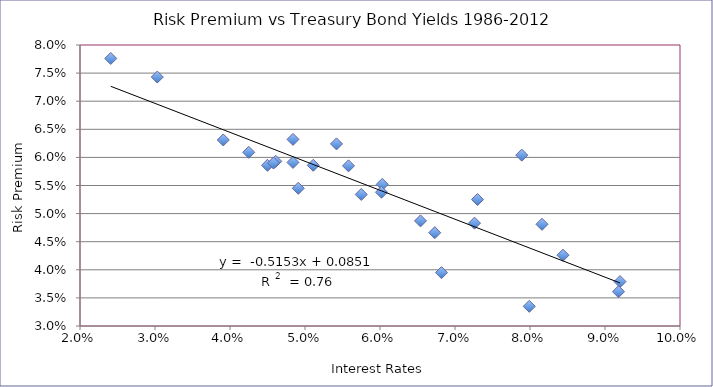
| Category | Series 0 |
|---|---|
| 0.0789 | 0.06 |
| 0.092 | 0.038 |
| 0.0918 | 0.036 |
| 0.0816 | 0.048 |
| 0.0844 | 0.043 |
| 0.073 | 0.053 |
| 0.0726 | 0.048 |
| 0.0654 | 0.049 |
| 0.0799 | 0.034 |
| 0.0603 | 0.055 |
| 0.0673 | 0.047 |
| 0.0602 | 0.054 |
| 0.0542 | 0.062 |
| 0.0682 | 0.04 |
| 0.0558 | 0.058 |
| 0.0575 | 0.053 |
| 0.0484 | 0.063 |
| 0.0511 | 0.059 |
| 0.0484 | 0.059 |
| 0.0461 | 0.059 |
| 0.0491 | 0.054 |
| 0.045 | 0.059 |
| 0.0303 | 0.074 |
| 0.0458 | 0.059 |
| 0.0425 | 0.061 |
| 0.0391 | 0.063 |
| 0.0241 | 0.078 |